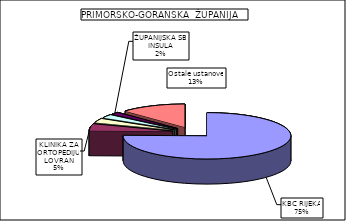
| Category | Series 0 |
|---|---|
| KBC RIJEKA | 75.341 |
| KLINIKA ZA ORTOPEDIJU LOVRAN | 4.859 |
| THALASSOTHERAPIA  OPATIJA SPECIJALNA BOLNICA ZA MEDICINSKU REHABILITACIJU BOLESTI SRCA, PLUĆA I REUMATIZMA | 3.024 |
| KBC ZAGREB  | 2.493 |
| ŽUPANIJSKA SB INSULA | 1.623 |
| Ostale ustanove | 12.659 |